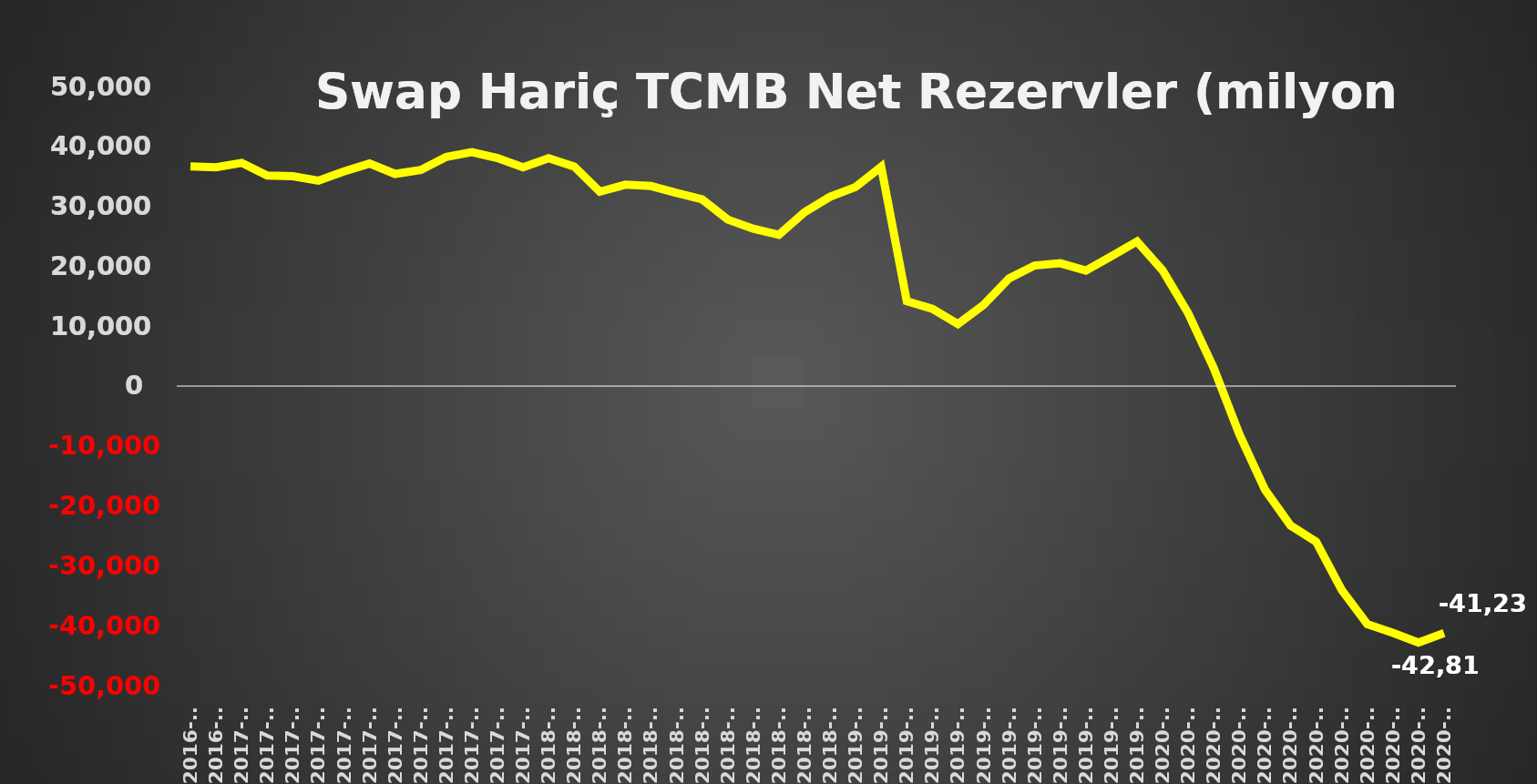
| Category | Net Rezerv |
|---|---|
| 2016-11 | 36659.436 |
| 2016-12 | 36509.717 |
| 2017-01 | 37257.661 |
| 2017-02 | 35136.45 |
| 2017-03 | 35014.21 |
| 2017-04 | 34276.228 |
| 2017-05 | 35818.06 |
| 2017-06 | 37144.645 |
| 2017-07 | 35407.013 |
| 2017-08 | 36074.228 |
| 2017-09 | 38265.321 |
| 2017-10 | 39043.799 |
| 2017-11 | 38055.787 |
| 2017-12 | 36521.975 |
| 2018-01 | 38031.996 |
| 2018-02 | 36648.89 |
| 2018-03 | 32442.738 |
| 2018-04 | 33605.922 |
| 2018-05 | 33390.261 |
| 2018-06 | 32252.581 |
| 2018-07 | 31172.058 |
| 2018-08 | 27793.274 |
| 2018-09 | 26267.522 |
| 2018-10 | 25260.214 |
| 2018-11 | 29012.905 |
| 2018-12 | 31605.097 |
| 2019-01 | 33227.296 |
| 2019-02 | 36600.491 |
| 2019-03 | 14165.733 |
| 2019-04 | 12899.541 |
| 2019-05 | 10344.429 |
| 2019-06 | 13553.041 |
| 2019-07 | 17975.621 |
| 2019-08 | 20122.431 |
| 2019-09 | 20495.998 |
| 2019-10 | 19275.583 |
| 2019-11 | 21664.992 |
| 2019-12 | 24130.926 |
| 2020-01 | 19297.927 |
| 2020-02 | 12153.814 |
| 2020-03 | 2985.227 |
| 2020-04 | -8040.993 |
| 2020-05 | -17274.503 |
| 2020-06 | -23264.957 |
| 2020-07 | -25971.54 |
| 2020-08 | -34029.163 |
| 2020-09 | -39739.335 |
| 2020-10 | -41193.157 |
| 2020-11 | -42814.603 |
| 2020-12 | -41237.151 |